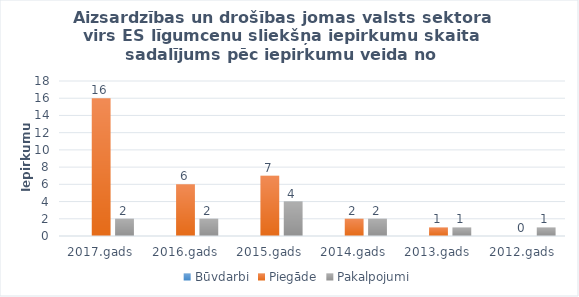
| Category | Būvdarbi | Piegāde | Pakalpojumi |
|---|---|---|---|
| 2017.gads | 0 | 16 | 2 |
| 2016.gads | 0 | 6 | 2 |
| 2015.gads | 0 | 7 | 4 |
| 2014.gads | 0 | 2 | 2 |
| 2013.gads | 0 | 1 | 1 |
| 2012.gads | 0 | 0 | 1 |